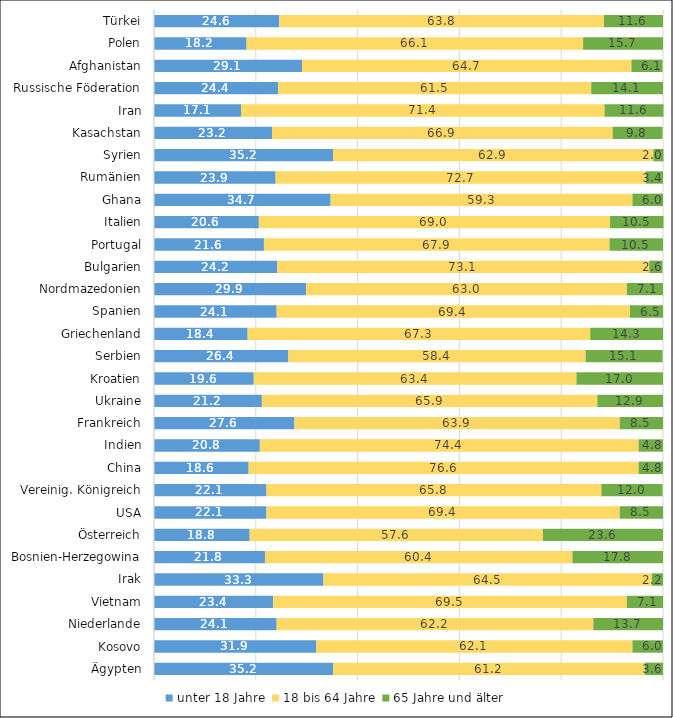
| Category | unter 18 Jahre | 18 bis 64 Jahre | 65 Jahre und älter |
|---|---|---|---|
| Ägypten | 35.2 | 61.2 | 3.6 |
| Kosovo | 31.9 | 62.1 | 6 |
| Niederlande | 24.1 | 62.2 | 13.7 |
| Vietnam | 23.4 | 69.5 | 7.1 |
| Irak | 33.3 | 64.5 | 2.2 |
| Bosnien-Herzegowina | 21.8 | 60.4 | 17.8 |
| Österreich | 18.8 | 57.6 | 23.6 |
| USA | 22.1 | 69.4 | 8.5 |
| Vereinig. Königreich | 22.1 | 65.8 | 12 |
| China | 18.6 | 76.6 | 4.8 |
| Indien | 20.8 | 74.4 | 4.8 |
| Frankreich | 27.6 | 63.9 | 8.5 |
| Ukraine | 21.2 | 65.9 | 12.9 |
| Kroatien | 19.6 | 63.4 | 17 |
| Serbien | 26.4 | 58.4 | 15.1 |
| Griechenland | 18.4 | 67.3 | 14.3 |
| Spanien | 24.1 | 69.4 | 6.5 |
| Nordmazedonien | 29.9 | 63 | 7.1 |
| Bulgarien | 24.2 | 73.1 | 2.6 |
| Portugal | 21.6 | 67.9 | 10.5 |
| Italien | 20.6 | 69 | 10.5 |
| Ghana | 34.7 | 59.3 | 6 |
| Rumänien | 23.9 | 72.7 | 3.4 |
| Syrien | 35.2 | 62.9 | 2 |
| Kasachstan | 23.2 | 66.9 | 9.8 |
| Iran | 17.1 | 71.4 | 11.6 |
| Russische Föderation | 24.4 | 61.5 | 14.1 |
| Afghanistan | 29.1 | 64.7 | 6.1 |
| Polen | 18.2 | 66.1 | 15.7 |
| Türkei | 24.6 | 63.8 | 11.6 |